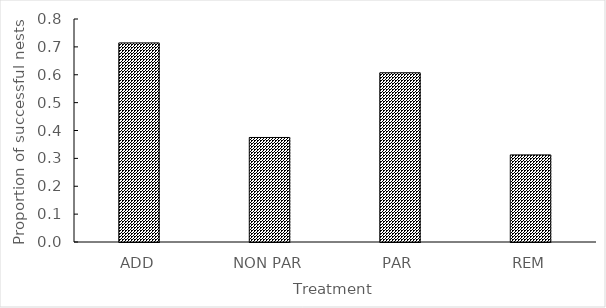
| Category | Series 0 |
|---|---|
| ADD | 0.714 |
| NON PAR | 0.375 |
| PAR | 0.607 |
| REM | 0.312 |